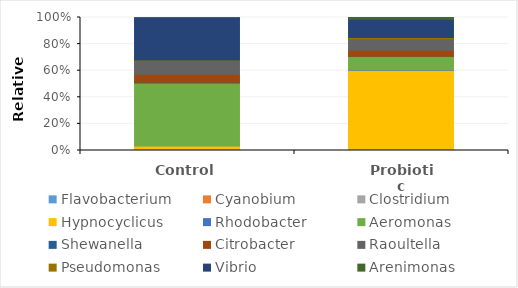
| Category | Flavobacterium | Cyanobium | Clostridium | Hypnocyclicus | Rhodobacter | Aeromonas | Shewanella | Citrobacter | Raoultella | Pseudomonas | Vibrio | Arenimonas |
|---|---|---|---|---|---|---|---|---|---|---|---|---|
| Control | 0.451 | 0.019 | 0.01 | 2.982 | 0.005 | 47.095 | 0.585 | 5.863 | 10.451 | 0.192 | 31.826 | 0.024 |
| Probiotic | 0.029 | 0.159 | 0.029 | 57.749 | 0.264 | 9.739 | 0.01 | 4.427 | 8.33 | 0.904 | 13.118 | 1.24 |